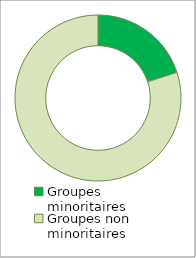
| Category | Series 0 |
|---|---|
| Groupes minoritaires | 0.2 |
| Groupes non minoritaires | 0.8 |